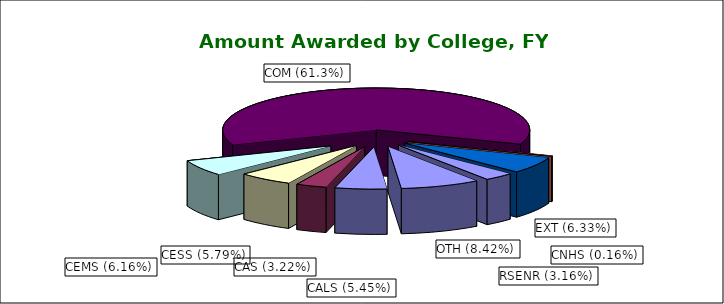
| Category | Series 0 | Series 1 |
|---|---|---|
| CALS (5.45%) | 0.054 | 0.054 |
| CAS (3.22%) | 0.032 | 0.032 |
| CESS (5.79%) | 0.058 | 0.058 |
| CEMS (6.16%) | 0.062 | 0.062 |
| COM (61.3%) | 0.613 | 0.613 |
| CNHS (0.16%) | 0.002 | 0.002 |
| EXT (6.33%) | 0.063 | 0.063 |
| RSENR (3.16%) | 0.032 | 0.032 |
| OTH (8.42%) | 0.084 | 0.084 |